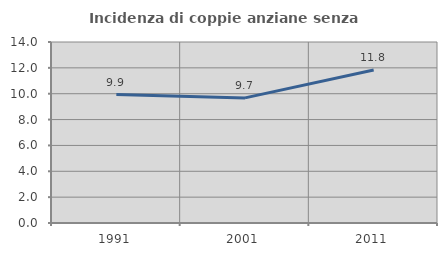
| Category | Incidenza di coppie anziane senza figli  |
|---|---|
| 1991.0 | 9.938 |
| 2001.0 | 9.677 |
| 2011.0 | 11.834 |